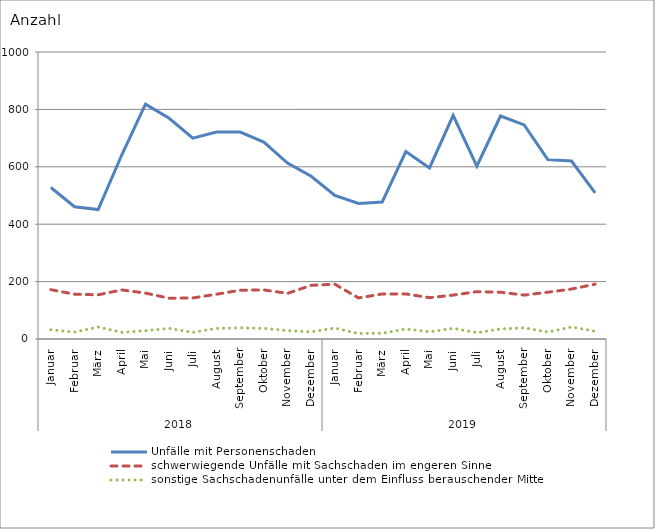
| Category | Unfälle mit Personenschaden | schwerwiegende Unfälle mit Sachschaden im engeren Sinne | sonstige Sachschadenunfälle unter dem Einfluss berauschender Mittel |
|---|---|---|---|
| 0 | 528 | 172 | 32 |
| 1 | 461 | 156 | 24 |
| 2 | 451 | 154 | 42 |
| 3 | 642 | 171 | 23 |
| 4 | 818 | 160 | 29 |
| 5 | 769 | 142 | 37 |
| 6 | 700 | 143 | 23 |
| 7 | 721 | 156 | 37 |
| 8 | 721 | 170 | 39 |
| 9 | 686 | 171 | 37 |
| 10 | 613 | 159 | 29 |
| 11 | 567 | 187 | 25 |
| 12 | 500 | 191 | 38 |
| 13 | 472 | 143 | 19 |
| 14 | 477 | 157 | 20 |
| 15 | 653 | 157 | 35 |
| 16 | 596 | 144 | 25 |
| 17 | 779 | 153 | 37 |
| 18 | 602 | 165 | 22 |
| 19 | 777 | 163 | 35 |
| 20 | 746 | 153 | 39 |
| 21 | 625 | 163 | 24 |
| 22 | 620 | 174 | 42 |
| 23 | 509 | 191 | 27 |